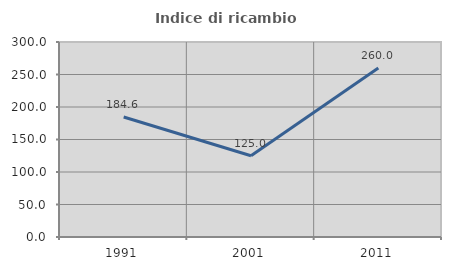
| Category | Indice di ricambio occupazionale  |
|---|---|
| 1991.0 | 184.615 |
| 2001.0 | 125 |
| 2011.0 | 260 |